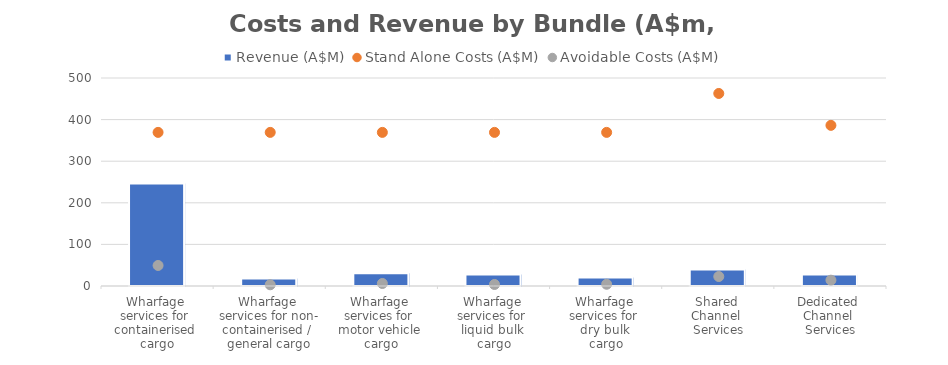
| Category | Revenue (A$M) |
|---|---|
| Wharfage 
services for 
containerised 
cargo | 246.37 |
| Wharfage 
services for non-
containerised / 
general cargo | 17.791 |
| Wharfage 
services for 
motor vehicle 
cargo | 30.737 |
| Wharfage 
services for 
liquid bulk 
cargo | 27.379 |
| Wharfage 
services for 
dry bulk 
cargo | 20.522 |
| Shared 
Channel 
Services | 39.804 |
| Dedicated 
Channel 
Services | 27.396 |